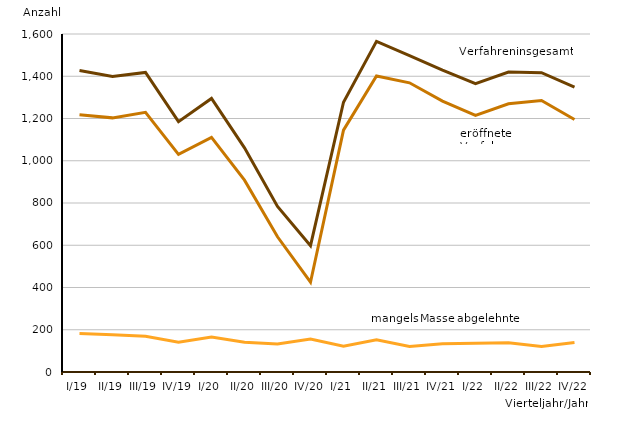
| Category | Series 0 | Series 1 | Series 2 |
|---|---|---|---|
| I/19 | 1427 | 1218 | 182 |
| II/19 | 1399 | 1203 | 176 |
| III/19 | 1418 | 1229 | 169 |
| IV/19 | 1185 | 1030 | 141 |
| I/20 | 1295 | 1111 | 166 |
| II/20 | 1061 | 908 | 141 |
| III/20 | 784 | 640 | 133 |
| IV/20 | 598 | 425 | 156 |
| I/21 | 1277 | 1145 | 122 |
| II/21 | 1565 | 1401 | 153 |
| III/21 | 1498 | 1369 | 121 |
| IV/21 | 1429 | 1282 | 134 |
| I/22 | 1365 | 1215 | 136 |
| II/22 | 1420 | 1270 | 138 |
| III/22 | 1417 | 1285 | 121 |
| IV/22 | 1349 | 1195 | 140 |